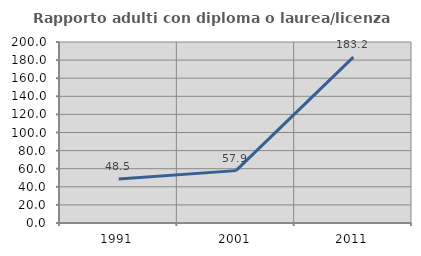
| Category | Rapporto adulti con diploma o laurea/licenza media  |
|---|---|
| 1991.0 | 48.5 |
| 2001.0 | 57.872 |
| 2011.0 | 183.207 |